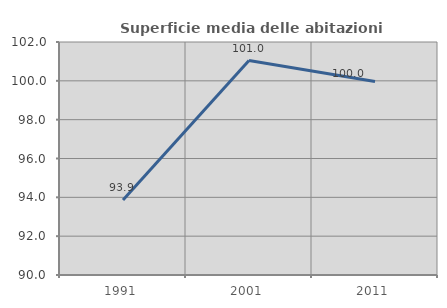
| Category | Superficie media delle abitazioni occupate |
|---|---|
| 1991.0 | 93.86 |
| 2001.0 | 101.045 |
| 2011.0 | 99.97 |